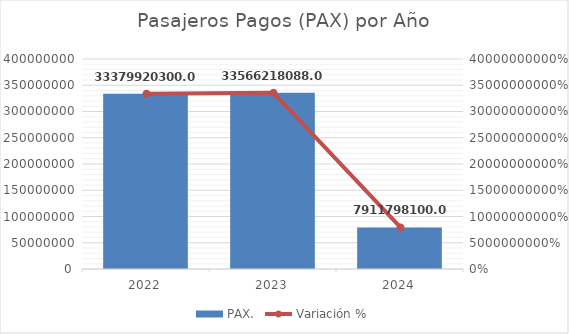
| Category | PAX. |
|---|---|
| 2022 | 333799203 |
| 2023 | 335662180.88 |
| 2024 | 79117981 |